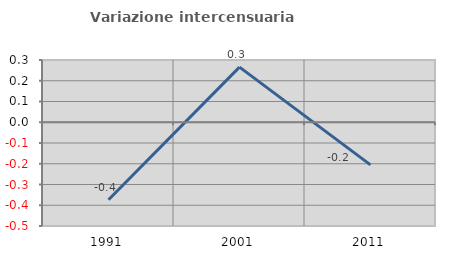
| Category | Variazione intercensuaria annua |
|---|---|
| 1991.0 | -0.374 |
| 2001.0 | 0.266 |
| 2011.0 | -0.205 |